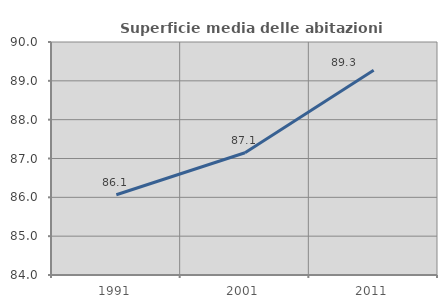
| Category | Superficie media delle abitazioni occupate |
|---|---|
| 1991.0 | 86.066 |
| 2001.0 | 87.148 |
| 2011.0 | 89.27 |